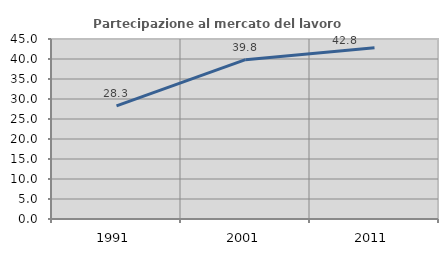
| Category | Partecipazione al mercato del lavoro  femminile |
|---|---|
| 1991.0 | 28.273 |
| 2001.0 | 39.831 |
| 2011.0 | 42.84 |